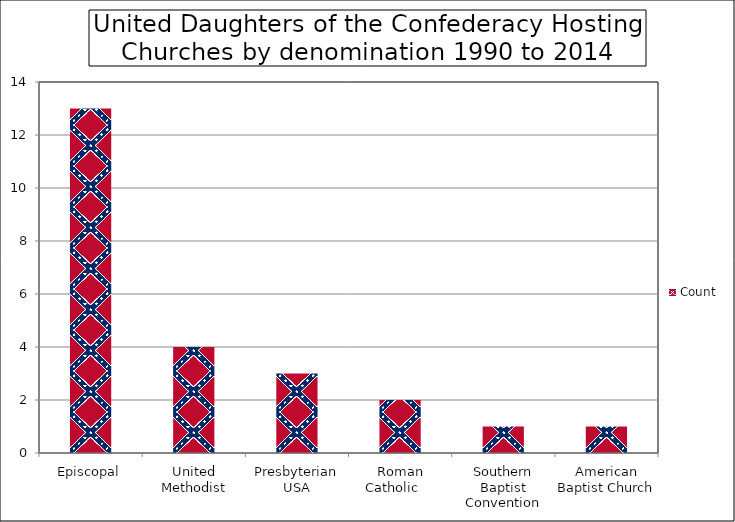
| Category | Count |
|---|---|
| Episcopal | 13 |
| United Methodist | 4 |
| Presbyterian USA | 3 |
| Roman Catholic     | 2 |
| Southern Baptist Convention | 1 |
| American Baptist Church | 1 |